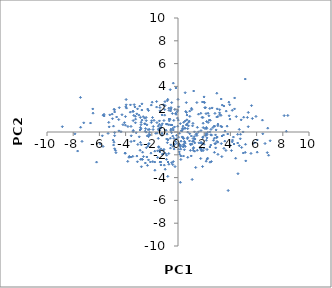
| Category | Series 0 |
|---|---|
| 6.047034312279502 | -1.771 |
| 1.8996415110933844 | 1.271 |
| 4.231998936353665 | -0.443 |
| 0.18424948059864074 | -4.415 |
| 3.832025674823919 | -5.134 |
| -3.248866115887301 | 0.81 |
| 2.361013082048552 | 1.42 |
| 2.519378961224598 | 0.231 |
| 0.8055621066655785 | 0.855 |
| 1.7405133993649038 | 1.641 |
| 3.6809694284060575 | 1.834 |
| 6.4729836015165505 | -0.159 |
| 1.1503002455104683 | -0.572 |
| -0.8302675615321096 | 0.679 |
| -0.7054473988117025 | -1.888 |
| 2.9548716284844923 | -0.492 |
| -3.1940596233818517 | -0.066 |
| 5.570983580629423 | -1.879 |
| 2.8751999732698335 | -1.391 |
| 1.2347217935646153 | -0.404 |
| 0.17790151491282047 | -1.297 |
| 3.9459608068082357 | 2.389 |
| 1.1096616695970796 | -0.815 |
| -3.925786178368599 | 2.097 |
| -2.21898946388357 | -0.212 |
| -6.6776213586947835 | 0.785 |
| -2.4793760931375233 | 0.3 |
| 0.6887620759695077 | 1.485 |
| -1.075818860944802 | -1.525 |
| 3.3772063206595346 | 2.363 |
| -2.7048244669344097 | -1.773 |
| -0.3198153434971519 | -0.553 |
| -4.918262225420026 | -1.146 |
| 1.988664589938669 | -1.073 |
| 0.47107407562630577 | 0.324 |
| -4.083281985070939 | 0.82 |
| 1.5669068762861806 | 0.018 |
| -2.89432349895327 | -1.603 |
| -2.528528512934547 | 0.733 |
| 0.41982239258789356 | -2.107 |
| 1.170124641809719 | -1.613 |
| -4.685951260612254 | 1.316 |
| -5.775517561604449 | -0.333 |
| -4.523972928316377 | 1.094 |
| -3.421533820116227 | 1.001 |
| -0.7757837348047522 | -0.67 |
| -1.5576950573239365 | -1.651 |
| 1.9193546418611314 | -1.632 |
| -0.2960340215029972 | -1.497 |
| -4.735814020955431 | -1.815 |
| -0.024902906210938623 | 0.506 |
| 1.4404870391792788 | 2.581 |
| 0.304540486284339 | 0.096 |
| 2.8747498922688752 | -1.015 |
| -1.045334313289163 | -2.907 |
| -2.42587581993685 | -0.012 |
| -2.7607142642447724 | 1.927 |
| 0.4854808519319678 | -1.181 |
| 5.676815686271187 | 1.184 |
| -2.636931687253922 | -2.157 |
| -0.7636856219395758 | -2.633 |
| 0.5521397763395441 | -1.274 |
| -1.6317442058879152 | 2.672 |
| 3.9664224242571438 | 1.131 |
| 8.382512100155447 | 1.452 |
| -3.7130340036089184 | -2.138 |
| -6.484427661128977 | 1.651 |
| -3.58727059686314 | 0.488 |
| 1.444864968422234 | -0.13 |
| -0.6792092444338018 | 1.14 |
| 1.604191951293681 | -0.951 |
| -2.1060598975750118 | -2.63 |
| 1.799950785334005 | -1.655 |
| 1.9866745134238675 | 2.62 |
| -0.6936915168886623 | 0.636 |
| 3.659139322017527 | -1.62 |
| 3.0450847434661554 | 0.549 |
| -3.065302933638145 | -1.094 |
| 0.48198570194440965 | -0.856 |
| 2.7916170805463723 | 0.514 |
| -0.9099055100206055 | 0.153 |
| 0.1184011563094833 | -1.085 |
| -4.508808416538954 | 0.099 |
| -1.7622735394111921 | -3.353 |
| 2.8167170306723492 | -1.023 |
| -5.283950764653616 | 0.842 |
| -0.35536315168584215 | -2.597 |
| -1.3796207045761866 | 2.145 |
| 5.850181587923567 | -0.953 |
| 2.501218291394947 | -1.144 |
| -2.5051904062654407 | 0.067 |
| -4.883248956831498 | 1.997 |
| 5.2981229512648005 | 1.279 |
| -0.265843969195275 | 0.444 |
| -1.2183488364663433 | 1.496 |
| 1.0209518362009546 | -0.349 |
| -0.8116686827692546 | -0.935 |
| -2.5355900747426117 | 0.704 |
| -1.1125451588328412 | 2.394 |
| -1.4187102640186997 | 0.976 |
| 1.1910837313397633 | -1.365 |
| -0.17987993146862838 | 1.638 |
| 2.38035865832213 | 1.043 |
| 1.1674781154926546 | -1.473 |
| 0.896058703423259 | -0.152 |
| 2.29369975550485 | 1.645 |
| 0.8605682314295295 | 0.959 |
| 0.1919262527514494 | -1.162 |
| 2.167766857991595 | -0.725 |
| -5.335974688399443 | -0.12 |
| 2.026666344309751 | 2.573 |
| -7.4352718826652335 | 0.416 |
| -2.2526189365044536 | 1.88 |
| 2.078826657869659 | -0.303 |
| 0.7950794284432429 | 0.538 |
| -1.072260631984391 | 1.006 |
| 4.578007614451878 | -3.659 |
| 1.2545820243692722 | 0.016 |
| -0.5745031944184031 | -1.416 |
| 5.1349374946405995 | 4.647 |
| -1.9731602613624752 | 2.613 |
| 1.746129268348774 | -0.965 |
| 4.0793424784092736 | -1.63 |
| 1.1964035936522326 | 3.596 |
| -4.926710473345753 | 0.512 |
| -1.3683910780709354 | 1.86 |
| 3.357360806661292 | -0.351 |
| -2.253547457461101 | -2.449 |
| 2.668259638364255 | 0.393 |
| 0.3912181161865333 | -1.292 |
| -2.3794163826329813 | -2.191 |
| -4.031219274384661 | -1.846 |
| -0.060685159703506575 | 1.772 |
| -1.196940878067872 | 0.718 |
| 7.037137703415545 | -0.77 |
| 5.3639202642871595 | 1.712 |
| -4.837399679571421 | -0.323 |
| 3.2972030561913166 | 2.892 |
| 3.05183030810398 | 1.359 |
| 3.3476779456081256 | 0.45 |
| -0.6088735106832407 | 1.127 |
| 0.6487391303288671 | 1.711 |
| 2.2635482388378416 | -2.294 |
| -3.3408332668856255 | -0.783 |
| -2.820178465602557 | 0.641 |
| -2.036105686398353 | 2.361 |
| 0.17883212730047535 | 0.734 |
| 2.214773910416551 | -1.535 |
| 0.03677559822935879 | -0.453 |
| -0.10913993238080572 | -0.597 |
| 2.6077615028975165 | 2.111 |
| 5.171701051093329 | -2.535 |
| 2.976557804743357 | -0.824 |
| -3.0950164000627454 | -2.608 |
| -1.37561535406722 | -2.637 |
| -1.3201166672341729 | 0.356 |
| 5.129643257385111 | -1.787 |
| -5.646186959080073 | 1.553 |
| 4.858941844176288 | -1.357 |
| 3.883483477206486 | 2.619 |
| 1.8667895634613403 | 2.632 |
| -3.56955972488989 | -0.331 |
| -2.4135282005126197 | -1.377 |
| -3.1399374133237914 | -2.112 |
| -3.7404637887237144 | -2.218 |
| -3.6414938096381726 | 1.741 |
| 0.7457903373359296 | -2.22 |
| -4.999764049003597 | 1.169 |
| -0.48197930424805785 | 2.576 |
| -1.306057718984843 | -2.892 |
| 0.20966533934059808 | -1.504 |
| -0.4549640433954234 | 0.611 |
| 0.6531337652449011 | 0.619 |
| -2.9006687161572584 | 0.173 |
| 2.1510506582522995 | -2.562 |
| -0.5628545948724457 | 1.848 |
| -2.4909828847752813 | -2.722 |
| -3.951921975157792 | 2.384 |
| -2.188455320186351 | 0.228 |
| 0.48607254936009703 | -1.555 |
| 4.676005043807557 | -1.203 |
| -0.8329172934726701 | -0.189 |
| -0.489546268189948 | -0.064 |
| -1.1922690174577741 | -1.967 |
| 4.974373277567726 | 0.005 |
| 5.15183279776188 | -1.079 |
| -3.2900763168464198 | 2.198 |
| 6.915032475166059 | -2.04 |
| -0.5371369421036476 | 2.142 |
| -2.2933761073852255 | -1.235 |
| -2.038306628919595 | 0.83 |
| -5.022280711415091 | 1.57 |
| 8.103514895787105 | 1.436 |
| 2.196412006253584 | 0.304 |
| 2.211276105571872 | -0.519 |
| -0.03822909725741992 | 1.222 |
| 0.41693204993621835 | -0.57 |
| -1.4690700429183854 | -1.345 |
| 0.21609716259945622 | -2.406 |
| 4.398923767171826 | -2.304 |
| -2.9559873926725304 | -0.423 |
| -0.6990674396214038 | -2.827 |
| 0.741736573228875 | 0.293 |
| -4.480858160981361 | 2.132 |
| -3.4264698778696454 | 0.034 |
| -1.600597377700655 | -0.104 |
| -4.885796096583559 | -0.896 |
| -0.4260989814584765 | 1.625 |
| 1.92708895849279 | 0.39 |
| 0.5491685861528357 | 3.446 |
| 2.269518862307452 | -0.033 |
| -0.9757271522930845 | -3.267 |
| -7.868204914744275 | -0.161 |
| -0.19393365712780597 | -0.823 |
| -7.32813316048994 | -0.823 |
| 5.613515969729701 | 2.314 |
| 4.551550030083382 | -0.205 |
| -1.01668455883147 | 1.969 |
| -2.1450243068492463 | -0.258 |
| -5.251283946846992 | 0.449 |
| 6.641669241047049 | -1.009 |
| -3.1426729571753738 | 1.59 |
| 3.347908054346751 | -2.159 |
| -7.662379318783151 | -1.672 |
| -2.7516484890229496 | -2.388 |
| 0.36433916856313386 | -0.461 |
| -4.010394318507968 | 0.596 |
| -4.835694013928485 | -0.058 |
| 2.1641833526285676 | -0.284 |
| 4.322076274231772 | 2.985 |
| 1.0671599860185046 | -1.067 |
| 4.557187977195853 | -0.966 |
| 1.9086075348808438 | -0.429 |
| 2.768848199425913 | 0.522 |
| 4.315713556342761 | 2.023 |
| 4.160113163312151 | -0.707 |
| 4.451618034816423 | 1.353 |
| 1.3711837440410723 | -0.215 |
| 0.0028828354311052854 | 2.862 |
| 3.985193969004374 | -1.187 |
| 0.5497601450805524 | 0.964 |
| 0.9692765573040615 | -1.121 |
| 2.443548107922166 | -2.649 |
| 1.875619893629662 | -3.031 |
| 0.6504645258498203 | 0.616 |
| -2.5380621159533057 | 1.21 |
| 3.0333579158271373 | -0.887 |
| 2.5544832723648705 | -0.279 |
| -1.6978911771575893 | -0.114 |
| -0.6635920982255893 | 0.979 |
| 2.3036036512740883 | 0.838 |
| -0.9910702160562156 | 2.664 |
| 0.04306738680921615 | -1.507 |
| -1.426987550631293 | 0.308 |
| 3.472186797912858 | -0.265 |
| -3.5971737472246996 | -2.196 |
| 3.5077666757047608 | 2.278 |
| 1.7337204666559332 | -2.323 |
| -2.9719120533050356 | 1.477 |
| 4.984095658307841 | -1.845 |
| 0.3855663804869246 | 0.513 |
| 0.7189320300959903 | -0.59 |
| -0.5400285559038406 | 0.62 |
| 0.8782495796683037 | -0.784 |
| 2.135183910675068 | -0.119 |
| 4.141395778146035 | 1.902 |
| 0.1105473963213436 | -0.11 |
| -1.1640488954010304 | -1.918 |
| 0.24427713496837652 | 0.1 |
| -1.9050720110889148 | 0.219 |
| 3.5906160793249557 | 0.073 |
| -1.312147238866422 | -2.634 |
| 6.443899562331703 | 1.039 |
| 0.41042072378681616 | -1.095 |
| -0.4009239843461888 | -0.358 |
| -4.0320376467337535 | -1.87 |
| -1.4897453573352928 | 0.251 |
| -1.0170673464369921 | 1.476 |
| 8.269540730532281 | 0.064 |
| -0.399373113784695 | -2.859 |
| -2.8584129712751274 | -2.398 |
| 3.171914590075943 | 1.682 |
| 2.1437519014874202 | 1.612 |
| 0.23674044001403804 | -0.802 |
| -1.5057340580024057 | -0.56 |
| 1.9871911531229858 | -1.422 |
| 2.436230753152055 | -1.316 |
| 0.40080171636689327 | -1.271 |
| -0.5416849614417221 | 0.249 |
| 3.5724659264159837 | -0.803 |
| 1.2783495333475259 | -0.955 |
| 0.21673990004526614 | -2.108 |
| -1.6093393923122334 | 0.823 |
| 0.744090429973274 | -0.01 |
| 2.219127345039516 | -0.207 |
| 1.760189427436579 | -0.904 |
| 1.2646934429834238 | -0.604 |
| -0.14402850574758402 | 1.553 |
| 2.047474027248973 | 2.132 |
| -1.3085643622877894 | -1.483 |
| 2.963473096183228 | 3.4 |
| 2.4234529397112285 | 0.003 |
| -1.7728229175626264 | -1.682 |
| -1.4738463484735909 | -1.29 |
| -0.5917512547639558 | 3.714 |
| -3.5837872623634968 | -0.836 |
| -2.813215209952402 | 0.853 |
| 0.9041904948244234 | 1.371 |
| 1.884509395601381 | -1.01 |
| 0.5665844944165647 | 0.326 |
| 2.178831302568159 | 0.919 |
| 2.9591571389372184 | 1.315 |
| -0.10974792557923045 | -0.291 |
| -2.7966614531879057 | -1.124 |
| 0.040289778310177486 | 2.206 |
| -0.5526332342286402 | -1.128 |
| -7.1957231645719615 | 0.805 |
| -3.2514698048984796 | 1.375 |
| 1.2906381873054185 | -0.624 |
| -5.206567823952191 | 1.502 |
| -1.5056894929178406 | 0.512 |
| -2.7531919484199046 | 2.468 |
| -2.066329767806902 | -1.856 |
| 2.7737807023116416 | -0.549 |
| 1.7654228198123156 | -1.556 |
| -0.892850003987584 | 0.7 |
| -2.9223277660999885 | 2.27 |
| -0.7826849217721955 | 2.868 |
| -2.7165483653798623 | -2.404 |
| 0.7017565436905016 | 0.701 |
| -3.4357931527859047 | 1.8 |
| -0.061757477494494846 | -0.99 |
| 0.36238009827495304 | 0.227 |
| -3.9582153900764374 | 2.848 |
| -4.0112515253361645 | 1.35 |
| 2.819336557888662 | 1.634 |
| -1.634174681110645 | 2.185 |
| 5.951756188555769 | 1.364 |
| -2.3433948746141953 | -0.346 |
| 0.01755031365638394 | 1.044 |
| -4.351525718476621 | 0.024 |
| -0.8629603390129279 | -2.038 |
| 2.428408971259546 | 2.065 |
| -0.8665434779071359 | -0.613 |
| 0.6779884854034169 | 1.065 |
| -1.222111910478527 | -0.299 |
| -0.8751009123786065 | -2.399 |
| -1.9446690423147828 | 1.273 |
| -0.2567339256345365 | -1.084 |
| 0.9447502615435426 | -1.612 |
| 3.27867599672839 | 1.454 |
| 0.018280134439837913 | -1.034 |
| -1.4194635302972962 | 0.673 |
| 0.9530074053599842 | -1.049 |
| 1.8392588839025878 | 1.284 |
| 1.268401153465712 | -1.682 |
| 3.2006473266735944 | 1.536 |
| 0.4285439897324006 | -0.553 |
| -0.3190317395291969 | 1.021 |
| 0.09850067200732582 | -1.746 |
| -0.35957031548069657 | 0.176 |
| -0.5374888632367044 | 0.111 |
| 2.0652196956974063 | 0.3 |
| 6.815826684732136 | -1.809 |
| -3.451744778899121 | -2.136 |
| 3.0486045076862185 | -1.963 |
| 0.5869293591997515 | 1.807 |
| -3.376465422226416 | 1.46 |
| 1.8894788909823699 | -0.499 |
| -0.9544397451888526 | -1.878 |
| -0.5342114892369141 | 2.027 |
| -1.3101472198011623 | 0.376 |
| 3.9118599407399257 | 1.421 |
| 1.8185150317864107 | -1.005 |
| -1.7730891088757106 | -2.635 |
| 2.5472198096660814 | -2.593 |
| 3.5076308503305875 | -1.437 |
| -2.3734117744357826 | 0.626 |
| -4.200522662347694 | 0.642 |
| -4.83954832785492 | -1.471 |
| 2.166990817958821 | 0.404 |
| -1.5534445518627698 | -2.231 |
| 2.10497790830835 | 2.134 |
| 4.823061642684035 | 1.063 |
| 2.9886546727881185 | -0.436 |
| 1.028729812791512 | 2.08 |
| -0.7754574637226594 | -0.693 |
| -0.9843748541728148 | 2.312 |
| 1.6704088852299404 | -1.395 |
| 1.9196973974887932 | 0.768 |
| -2.1708598667548182 | -0.031 |
| 0.48439735250297894 | -0.841 |
| 0.3217223568320174 | -0.432 |
| -0.6866947253047454 | 1.901 |
| -0.3887470911654232 | 0.329 |
| 1.112838704949429 | 0.54 |
| -2.2385278255882732 | -1.051 |
| -0.8073379005027115 | 2.746 |
| -1.2752388683836435 | 0.558 |
| 6.850739977321383 | 0.335 |
| 3.3067354023700934 | -1.018 |
| 1.564608242672751 | 1.561 |
| -0.025117424530277866 | 1.921 |
| -6.214967190244098 | -2.643 |
| 0.09933174805065141 | -1.186 |
| -1.1324401688901602 | -1.6 |
| -5.635380277313017 | 1.404 |
| -4.837404447177381 | 1.754 |
| 1.4719018092198042 | -1.601 |
| 1.3517675140487244 | -3.112 |
| -0.7019789059469953 | 2.092 |
| 2.5131412651061185 | -0.239 |
| -5.72123333303111 | -1.266 |
| -2.014164015814268 | 0.99 |
| 0.8942304653291152 | 1.833 |
| 6.054927318109329 | -0.7 |
| 3.7973222928816215 | -0.176 |
| 0.6366690373922368 | 2.579 |
| -1.4262571637155141 | -1.611 |
| -0.5803853315952024 | -0.542 |
| -2.8715830633176536 | 1.277 |
| -2.330532540887414 | -2.928 |
| 1.196425198079785 | -0.809 |
| 1.0113769602965343 | -2.104 |
| 2.8649475451341426 | -0.256 |
| 3.2743127480932928 | 0.509 |
| -2.869718407290257 | -0.911 |
| -2.4237139092930042 | 0.997 |
| 4.141449680893687 | -0.862 |
| -3.411277132001403 | 0.142 |
| -2.817410954452455 | 0.275 |
| -3.9868745413475524 | 2.203 |
| 4.67782221169768 | 0.229 |
| 1.7543764035865872 | 0.118 |
| 1.051999056145366 | 1.96 |
| -2.790868402150002 | -3.046 |
| 1.7704062778386687 | -1.506 |
| 0.12401237120291202 | -1.947 |
| 3.1799071761298032 | 1.956 |
| 5.361504518740549 | 0.465 |
| -1.8883890094512246 | 0.481 |
| -3.2373129892093515 | 1.128 |
| -0.2792637809352672 | -1.089 |
| -3.818231973651489 | 0.481 |
| -3.83703717393408 | -2.576 |
| -0.4888746261523889 | -2.696 |
| -3.0886101371955617 | 2.031 |
| 2.909541062041676 | 0.183 |
| 1.1406231747929871 | 0.757 |
| 1.9903866291446957 | 3.078 |
| -7.445491731780676 | 3.033 |
| -1.8303979776276063 | 1.022 |
| 4.273050938336929 | -1.055 |
| -3.6305706857677347 | 2.378 |
| -0.1575515389461717 | 3.86 |
| -1.2195606599022504 | -0.099 |
| 4.756378007273933 | -0.595 |
| -1.4059292445124756 | 0.128 |
| 0.5505768716571143 | -0.974 |
| -2.2224255279515615 | -1.011 |
| -0.24519559706173527 | 1.975 |
| -2.3160081339156884 | 2.012 |
| -4.7709991072813525 | -1.607 |
| 3.7493518496486677 | 0.514 |
| -5.935374709067165 | -1.039 |
| -5.716835961357377 | 1.476 |
| 0.4303082730697645 | 0.85 |
| -8.829190777547362 | 0.467 |
| -3.343653974682608 | 2.396 |
| -0.7787844360219335 | -3.891 |
| -3.4300419349017885 | 1.818 |
| 2.9945921093992913 | 2.028 |
| -1.3779660020607556 | -1.755 |
| 5.015312178180174 | 1.297 |
| 0.33723421137061105 | 0.321 |
| -2.656018576386782 | 1.345 |
| -2.2473701630244176 | -0.407 |
| -1.924227963520575 | -2.595 |
| -2.43318632715931 | 1.28 |
| 2.779470019354117 | -1.784 |
| -0.37798782467605924 | -1.26 |
| 1.0824490542167071 | -4.164 |
| -4.843176135695533 | 1.945 |
| -1.474033467164469 | 0.178 |
| -4.9478826032185115 | -0.711 |
| 1.445484495105573 | -0.305 |
| -2.868820019986131 | 0.4 |
| 2.2187341098117326 | -2.381 |
| -6.506203064036894 | 2.022 |
| -0.2262474709181512 | -3.033 |
| 4.770850340203871 | -0.198 |
| 2.712659648420735 | -0.728 |
| 3.0454862931602853 | 0.692 |
| -2.749757349205495 | 1.043 |
| -4.275078346586217 | 1.514 |
| 2.464057662300153 | 1.03 |
| -0.35576820671986004 | 4.284 |
| 0.7443202341146535 | -0.485 |
| 1.4812248957789003 | 0.408 |
| -2.2824164523979382 | 0.208 |